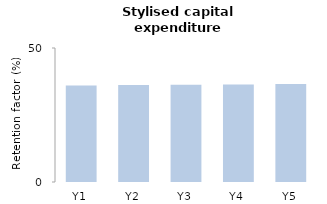
| Category | Capex |
|---|---|
| 1.0 | 36.045 |
| 2.0 | 36.16 |
| 3.0 | 36.286 |
| 4.0 | 36.425 |
| 5.0 | 36.578 |